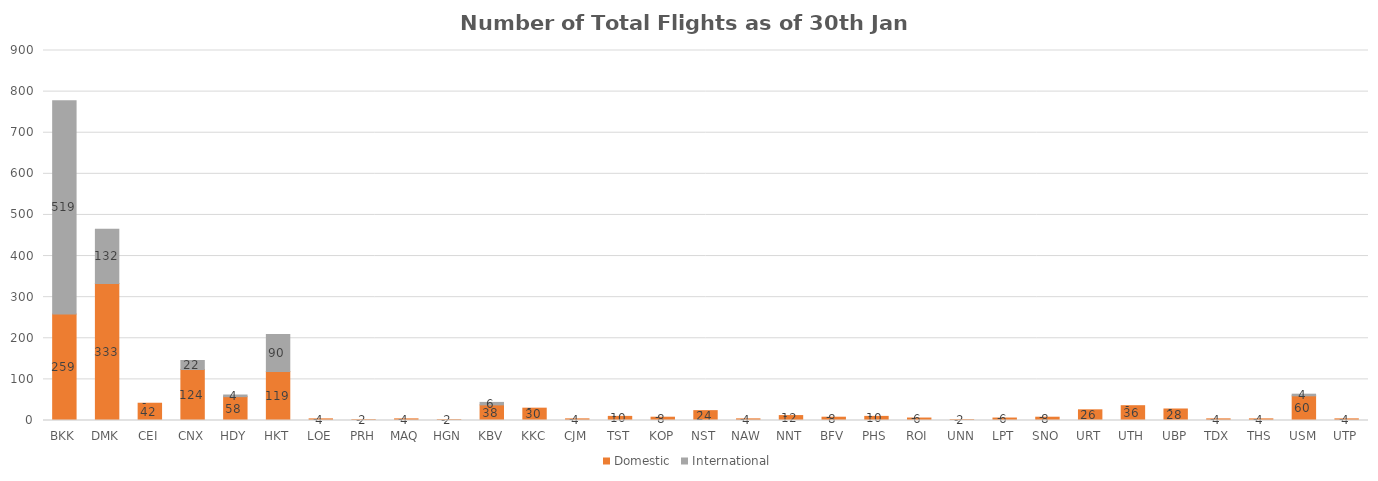
| Category | Domestic | International |
|---|---|---|
| BKK | 259 | 519 |
| DMK | 333 | 132 |
| CEI | 42 | 0 |
| CNX | 124 | 22 |
| HDY | 58 | 4 |
| HKT | 119 | 90 |
| LOE | 4 | 0 |
| PRH | 2 | 0 |
| MAQ | 4 | 0 |
| HGN | 2 | 0 |
| KBV | 38 | 6 |
| KKC | 30 | 0 |
| CJM | 4 | 0 |
| TST | 10 | 0 |
| KOP | 8 | 0 |
| NST | 24 | 0 |
| NAW | 4 | 0 |
| NNT | 12 | 0 |
| BFV | 8 | 0 |
| PHS | 10 | 0 |
| ROI | 6 | 0 |
| UNN | 2 | 0 |
| LPT | 6 | 0 |
| SNO | 8 | 0 |
| URT | 26 | 0 |
| UTH | 36 | 0 |
| UBP | 28 | 0 |
| TDX | 4 | 0 |
| THS | 4 | 0 |
| USM | 60 | 4 |
| UTP | 4 | 0 |